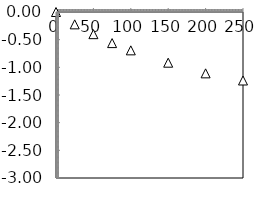
| Category | Series 2 |
|---|---|
| 0.0 | 0 |
| 25.0 | -0.223 |
| 50.0 | -0.4 |
| 75.0 | -0.562 |
| 100.0 | -0.693 |
| 150.0 | -0.916 |
| 200.0 | -1.109 |
| 250.0 | -1.238 |